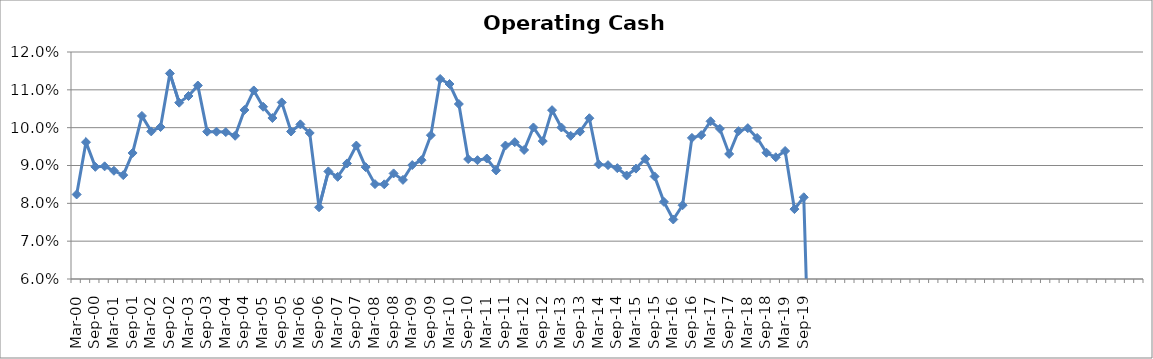
| Category | Operating Cash Margin |
|---|---|
| Mar-00 | 0.082 |
| Jun-00 | 0.096 |
| Sep-00 | 0.09 |
| Dec-00 | 0.09 |
| Mar-01 | 0.089 |
| Jun-01 | 0.087 |
| Sep-01 | 0.093 |
| Dec-01 | 0.103 |
| Mar-02 | 0.099 |
| Jun-02 | 0.1 |
| Sep-02 | 0.114 |
| Dec-02 | 0.107 |
| Mar-03 | 0.108 |
| Jun-03 | 0.111 |
| Sep-03 | 0.099 |
| Dec-03 | 0.099 |
| Mar-04 | 0.099 |
| Jun-04 | 0.098 |
| Sep-04 | 0.105 |
| Dec-04 | 0.11 |
| Mar-05 | 0.106 |
| Jun-05 | 0.103 |
| Sep-05 | 0.107 |
| Dec-05 | 0.099 |
| Mar-06 | 0.101 |
| Jun-06 | 0.099 |
| Sep-06 | 0.079 |
| Dec-06 | 0.088 |
| Mar-07 | 0.087 |
| Jun-07 | 0.091 |
| Sep-07 | 0.095 |
| Dec-07 | 0.09 |
| Mar-08 | 0.085 |
| Jun-08 | 0.085 |
| Sep-08 | 0.088 |
| Dec-08 | 0.086 |
| Mar-09 | 0.09 |
| Jun-09 | 0.091 |
| Sep-09 | 0.098 |
| Dec-09 | 0.113 |
| Mar-10 | 0.112 |
| Jun-10 | 0.106 |
| Sep-10 | 0.092 |
| Dec-10 | 0.091 |
| Mar-11 | 0.092 |
| Jun-11 | 0.089 |
| Sep-11 | 0.095 |
| Dec-11 | 0.096 |
| Mar-12 | 0.094 |
| Jun-12 | 0.1 |
| Sep-12 | 0.096 |
| Dec-12 | 0.105 |
| Mar-13 | 0.1 |
| Jun-13 | 0.098 |
| Sep-13 | 0.099 |
| Dec-13 | 0.102 |
| Mar-14 | 0.09 |
| Jun-14 | 0.09 |
| Sep-14 | 0.089 |
| Dec-14 | 0.087 |
| Mar-15 | 0.089 |
| Jun-15 | 0.092 |
| Sep-15 | 0.087 |
| Dec-15 | 0.08 |
| Mar-16 | 0.076 |
| Jun-16 | 0.079 |
| Sep-16 | 0.097 |
| Dec-16 | 0.098 |
| Mar-17 | 0.102 |
| Jun-17 | 0.1 |
| Sep-17 | 0.093 |
| Dec-17 | 0.099 |
| Mar-18 | 0.1 |
| Jun-18 | 0.097 |
| Sep-18 | 0.093 |
| Dec-18 | 0.092 |
| Mar-19 | 0.094 |
| Jun-19 | 0.078 |
| Sep-19 | 0.082 |